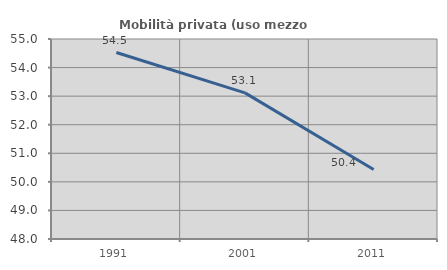
| Category | Mobilità privata (uso mezzo privato) |
|---|---|
| 1991.0 | 54.527 |
| 2001.0 | 53.114 |
| 2011.0 | 50.432 |